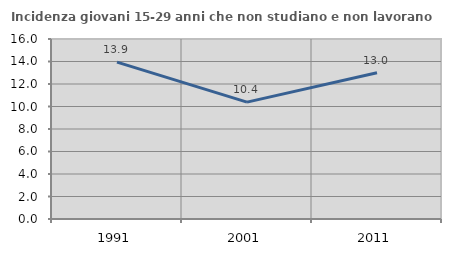
| Category | Incidenza giovani 15-29 anni che non studiano e non lavorano  |
|---|---|
| 1991.0 | 13.943 |
| 2001.0 | 10.392 |
| 2011.0 | 13 |